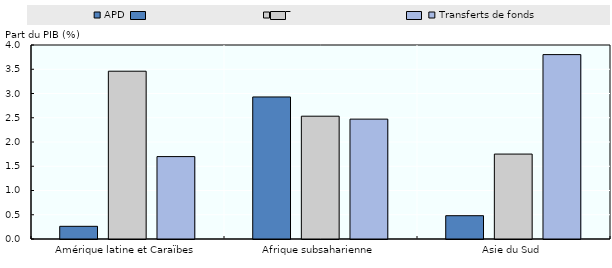
| Category | APD | IDE | Transferts de fonds |
|---|---|---|---|
| Amérique latine et Caraïbes | 0.261 | 3.46 | 1.699 |
| Afrique subsaharienne | 2.929 | 2.532 | 2.471 |
| Asie du Sud | 0.481 | 1.751 | 3.802 |